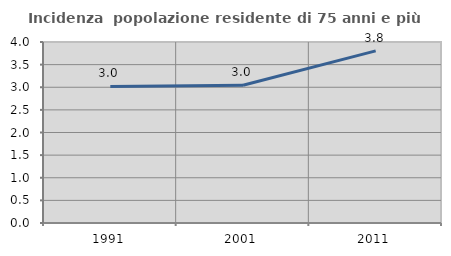
| Category | Incidenza  popolazione residente di 75 anni e più |
|---|---|
| 1991.0 | 3.018 |
| 2001.0 | 3.044 |
| 2011.0 | 3.804 |